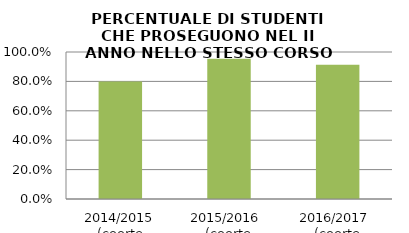
| Category | 2014/2015 (coorte 2013/14) 2015/2016  (coorte 2014/15) 2016/2017  (coorte 2015/16) |
|---|---|
| 2014/2015 (coorte 2013/14) | 0.8 |
| 2015/2016  (coorte 2014/15) | 0.955 |
| 2016/2017  (coorte 2015/16) | 0.913 |